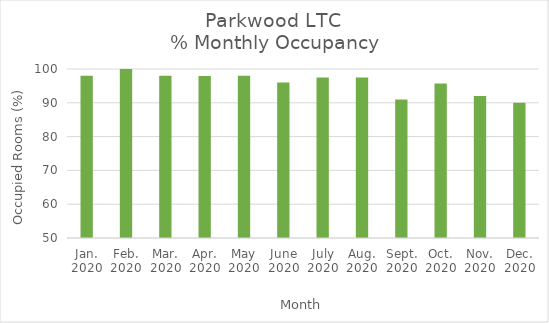
| Category | % Monthly Occupancy |
|---|---|
| Jan.
2020 | 98 |
| Feb.
2020 | 100 |
| Mar.
2020 | 98 |
| Apr.
2020 | 97.95 |
| May
2020 | 98 |
| June
2020 | 96 |
| July
2020 | 97.5 |
| Aug.
2020 | 97.5 |
| Sept.
2020 | 91 |
| Oct.
2020 | 95.7 |
| Nov.
2020 | 92 |
| Dec.
2020 | 90 |